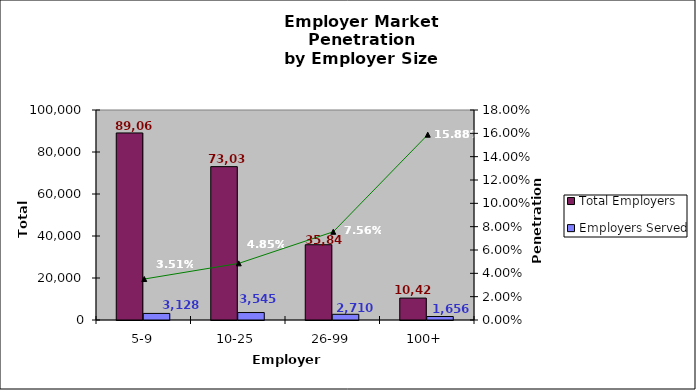
| Category | Total Employers | Employers Served |
|---|---|---|
| 5-9 | 89064 | 3128 |
| 10-25 | 73035 | 3545 |
| 26-99 | 35841 | 2710 |
| 100+ | 10425 | 1656 |